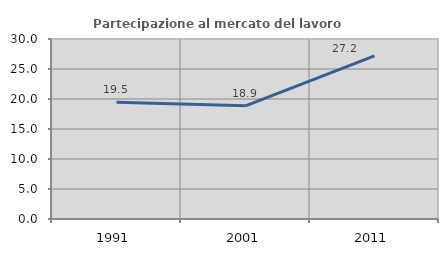
| Category | Partecipazione al mercato del lavoro  femminile |
|---|---|
| 1991.0 | 19.456 |
| 2001.0 | 18.859 |
| 2011.0 | 27.198 |